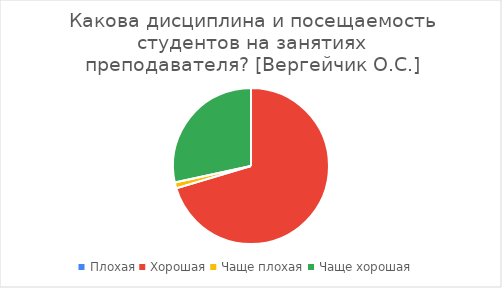
| Category | Series 0 |
|---|---|
| Плохая | 0 |
| Хорошая | 57 |
| Чаще плохая | 1 |
| Чаще хорошая | 23 |